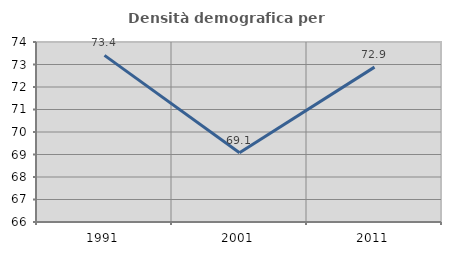
| Category | Densità demografica |
|---|---|
| 1991.0 | 73.405 |
| 2001.0 | 69.081 |
| 2011.0 | 72.883 |